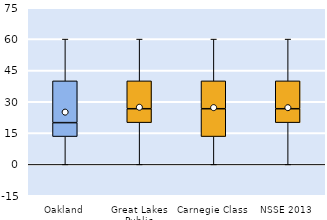
| Category | 25th | 50th | 75th |
|---|---|---|---|
| Oakland | 13.333 | 6.667 | 20 |
| Great Lakes Public | 20 | 6.667 | 13.333 |
| Carnegie Class | 13.333 | 13.333 | 13.333 |
| NSSE 2013 | 20 | 6.667 | 13.333 |